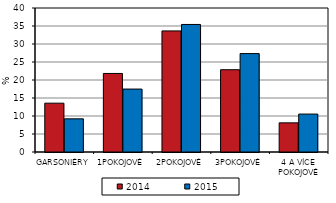
| Category | 2014 | 2015 |
|---|---|---|
| GARSONIÉRY | 13.563 | 9.217 |
| 1POKOJOVÉ | 21.816 | 17.482 |
| 2POKOJOVÉ | 33.634 | 35.427 |
| 3POKOJOVÉ | 22.859 | 27.338 |
| 4 A VÍCE POKOJOVÉ | 8.1 | 10.536 |